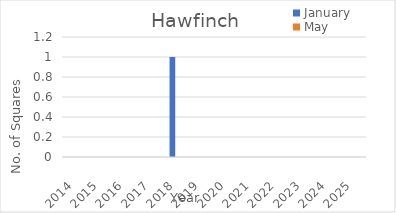
| Category | January | May |
|---|---|---|
| 2014.0 | 0 | 0 |
| 2015.0 | 0 | 0 |
| 2016.0 | 0 | 0 |
| 2017.0 | 0 | 0 |
| 2018.0 | 1 | 0 |
| 2019.0 | 0 | 0 |
| 2020.0 | 0 | 0 |
| 2021.0 | 0 | 0 |
| 2022.0 | 0 | 0 |
| 2023.0 | 0 | 0 |
| 2024.0 | 0 | 0 |
| 2025.0 | 0 | 0 |